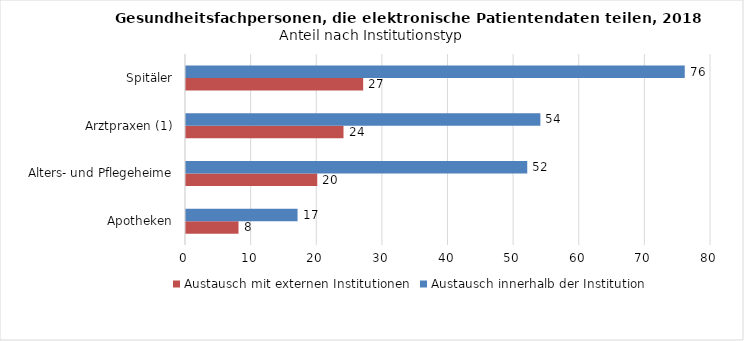
| Category | Austausch mit externen Institutionen | Austausch innerhalb der Institution |
|---|---|---|
| Apotheken | 8 | 17 |
| Alters- und Pflegeheime | 20 | 52 |
| Arztpraxen (1) | 24 | 54 |
| Spitäler | 27 | 76 |